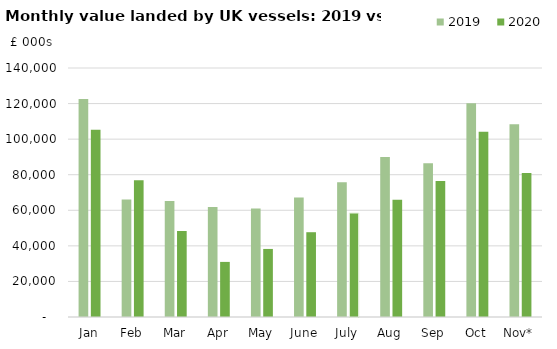
| Category | 2019 | 2020 |
|---|---|---|
| Jan | 122605.58 | 105304 |
| Feb | 66130.453 | 76925.17 |
| Mar | 65272.385 | 48363.805 |
| Apr | 61900.917 | 30975.669 |
| May | 60965.793 | 38267.087 |
| June | 67234.833 | 47670.004 |
| July | 75811.111 | 58442.362 |
| Aug | 89956.275 | 65875.901 |
| Sep | 86456.163 | 76479.733 |
| Oct | 120129.41 | 104191.811 |
| Nov* | 108409.424 | 80969.166 |